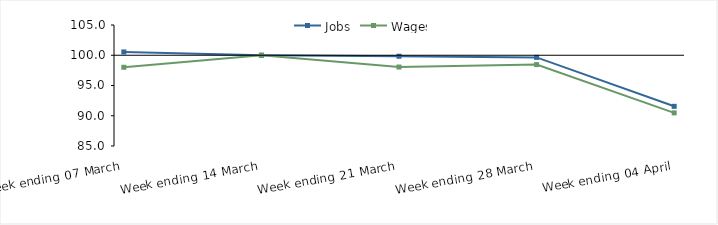
| Category | Jobs | Wages |
|---|---|---|
| 0 | 100.548 | 98.013 |
| 1900-01-01 | 100 | 100 |
| 1900-01-02 | 99.837 | 98.053 |
| 1900-01-03 | 99.646 | 98.454 |
| 1900-01-04 | 91.559 | 90.474 |